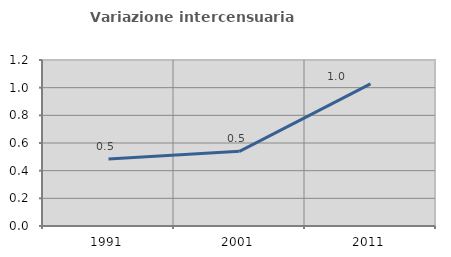
| Category | Variazione intercensuaria annua |
|---|---|
| 1991.0 | 0.484 |
| 2001.0 | 0.54 |
| 2011.0 | 1.028 |